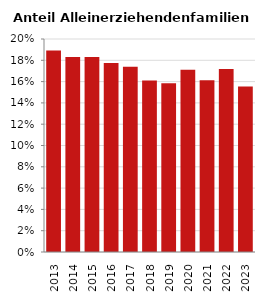
| Category | Anteil Alleinerziehende an Familien |
|---|---|
| 2013.0 | 0.189 |
| 2014.0 | 0.183 |
| 2015.0 | 0.183 |
| 2016.0 | 0.178 |
| 2017.0 | 0.174 |
| 2018.0 | 0.161 |
| 2019.0 | 0.159 |
| 2020.0 | 0.171 |
| 2021.0 | 0.161 |
| 2022.0 | 0.172 |
| 2023.0 | 0.155 |